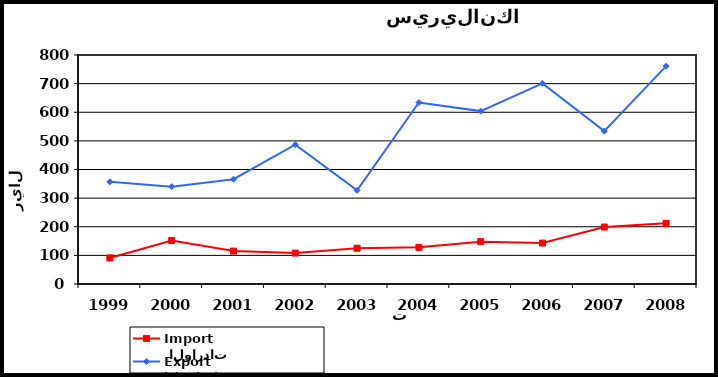
| Category |  الواردات           Import | الصادرات          Export |
|---|---|---|
| 1999.0 | 91 | 357 |
| 2000.0 | 152 | 340 |
| 2001.0 | 115 | 366 |
| 2002.0 | 108 | 487 |
| 2003.0 | 125 | 327 |
| 2004.0 | 128 | 634 |
| 2005.0 | 148 | 604 |
| 2006.0 | 143 | 701 |
| 2007.0 | 199 | 534 |
| 2008.0 | 212 | 761 |